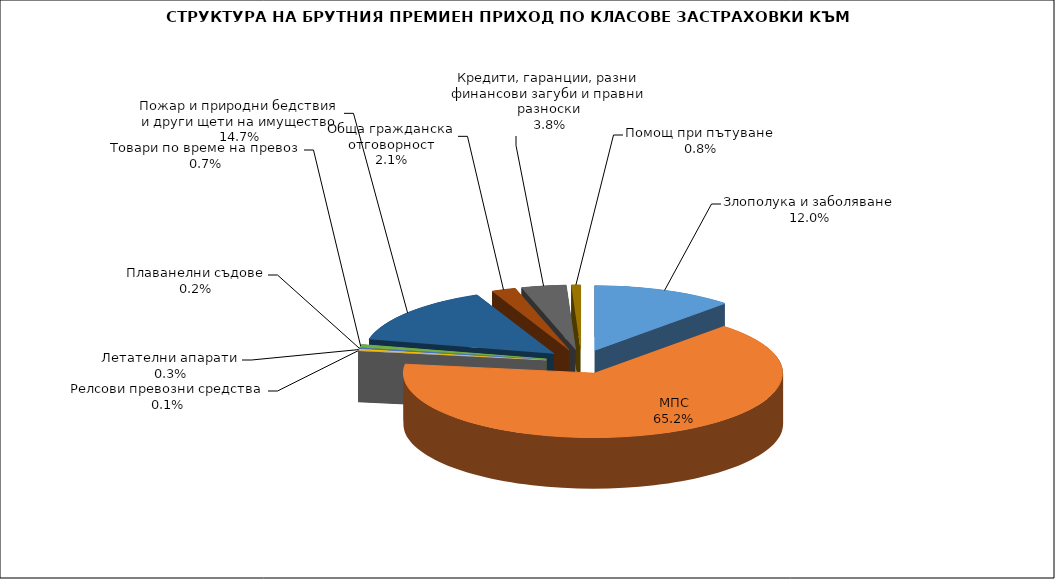
| Category | Злополука и заболяване |
|---|---|
| Злополука и заболяване | 0.12 |
| МПС | 0.652 |
| Релсови превозни средства | 0.001 |
| Летателни апарати | 0.003 |
| Плаванелни съдове | 0.002 |
| Товари по време на превоз | 0.007 |
| Пожар и природни бедствия и други щети на имущество | 0.147 |
| Обща гражданска отговорност | 0.021 |
| Кредити, гаранции, разни финансови загуби и правни разноски | 0.038 |
| Помощ при пътуване | 0.008 |